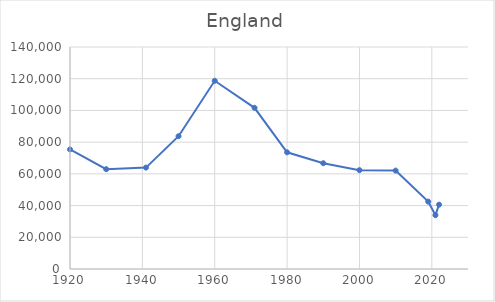
| Category | England |
|---|---|
| 1920.0 | 75425 |
| 1930.0 | 62962 |
| 1941.0 | 63941 |
| 1950.0 | 83751 |
| 1960.0 | 118696 |
| 1971.0 | 101638 |
| 1980.0 | 73582 |
| 1990.0 | 66700 |
| 2000.0 | 62323 |
| 2010.0 | 62049 |
| 2019.0 | 42501 |
| 2021.0 | 33946 |
| 2022.0 | 40576 |